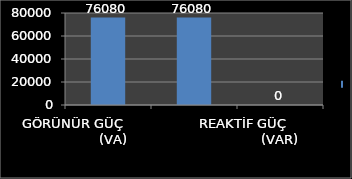
| Category | Series 0 |
|---|---|
| GÖRÜNÜR GÜÇ                    (VA) | 76080 |
| AKTİF  GÜÇ                (W) | 76080 |
| REAKTİF GÜÇ                  (VAR) | 0 |